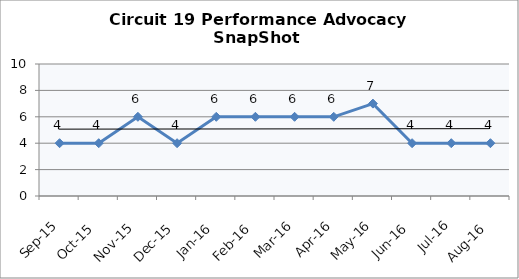
| Category | Circuit 19 |
|---|---|
| Sep-15 | 4 |
| Oct-15 | 4 |
| Nov-15 | 6 |
| Dec-15 | 4 |
| Jan-16 | 6 |
| Feb-16 | 6 |
| Mar-16 | 6 |
| Apr-16 | 6 |
| May-16 | 7 |
| Jun-16 | 4 |
| Jul-16 | 4 |
| Aug-16 | 4 |